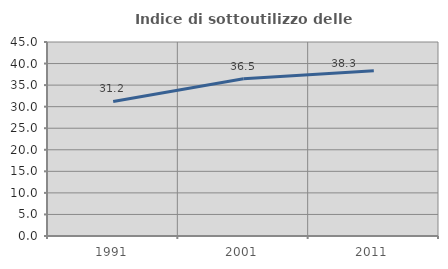
| Category | Indice di sottoutilizzo delle abitazioni  |
|---|---|
| 1991.0 | 31.211 |
| 2001.0 | 36.477 |
| 2011.0 | 38.341 |